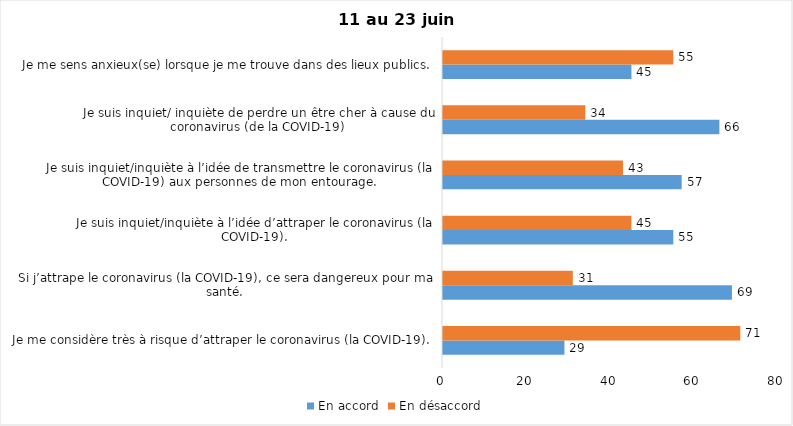
| Category | En accord | En désaccord |
|---|---|---|
| Je me considère très à risque d’attraper le coronavirus (la COVID-19). | 29 | 71 |
| Si j’attrape le coronavirus (la COVID-19), ce sera dangereux pour ma santé. | 69 | 31 |
| Je suis inquiet/inquiète à l’idée d’attraper le coronavirus (la COVID-19). | 55 | 45 |
| Je suis inquiet/inquiète à l’idée de transmettre le coronavirus (la COVID-19) aux personnes de mon entourage. | 57 | 43 |
| Je suis inquiet/ inquiète de perdre un être cher à cause du coronavirus (de la COVID-19) | 66 | 34 |
| Je me sens anxieux(se) lorsque je me trouve dans des lieux publics. | 45 | 55 |